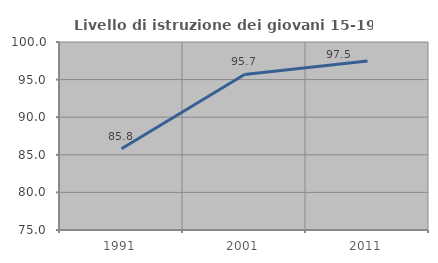
| Category | Livello di istruzione dei giovani 15-19 anni |
|---|---|
| 1991.0 | 85.81 |
| 2001.0 | 95.68 |
| 2011.0 | 97.472 |